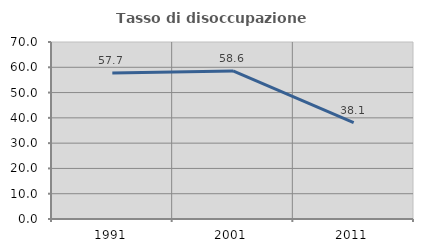
| Category | Tasso di disoccupazione giovanile  |
|---|---|
| 1991.0 | 57.735 |
| 2001.0 | 58.58 |
| 2011.0 | 38.095 |